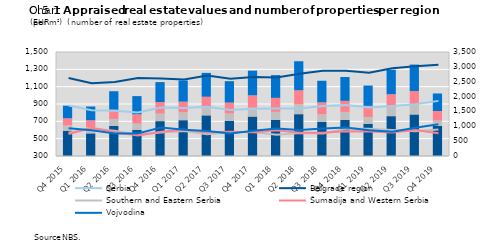
| Category | Series 5 | Регион Јужне и Источне Србије | Шумадија | Регион Војводине |
|---|---|---|---|---|
| Q4 2015 | 850 | 176 | 243 | 423 |
| Q1 2016 | 762 | 208 | 232 | 464 |
| Q2 2016 | 1014 | 233 | 310 | 623 |
| Q3 2016 | 882 | 207 | 315 | 612 |
| Q4 2016 | 1173 | 255 | 388 | 671 |
| Q1 2017 | 1205 | 262 | 362 | 713 |
| Q2 2017 | 1368 | 255 | 371 | 803 |
| Q3 2017 | 1179 | 249 | 371 | 719 |
| Q4 2017 | 1328 | 296 | 418 | 830 |
| Q1 2018 | 1215 | 271 | 470 | 767 |
| Q2 2018 | 1408 | 331 | 473 | 977 |
| Q3 2018 | 1149 | 253 | 405 | 725 |
| Q4 2018 | 1217 | 266 | 373 | 803 |
| Q1 2019 | 1083 | 229 | 376 | 683 |
| Q2 2019 | 1341 | 303 | 435 | 824 |
| Q3 2019 | 1398 | 312 | 474 | 892 |
| Q4 2019 | 1015 | 176 | 324 | 589 |